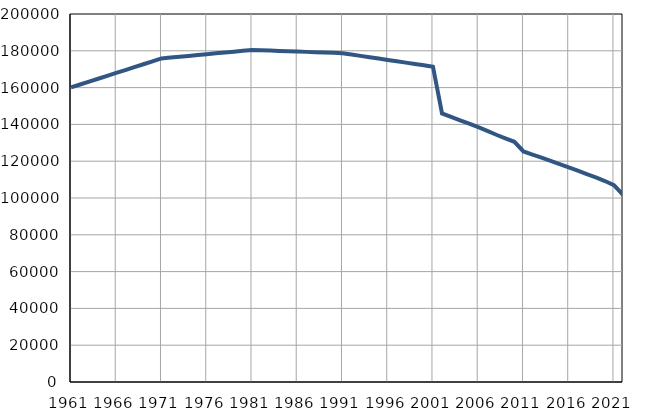
| Category | Број
становника |
|---|---|
| 1961.0 | 160096 |
| 1962.0 | 161671 |
| 1963.0 | 163246 |
| 1964.0 | 164822 |
| 1965.0 | 166397 |
| 1966.0 | 167972 |
| 1967.0 | 169547 |
| 1968.0 | 171122 |
| 1969.0 | 172698 |
| 1970.0 | 174273 |
| 1971.0 | 175848 |
| 1972.0 | 176310 |
| 1973.0 | 176771 |
| 1974.0 | 177233 |
| 1975.0 | 177694 |
| 1976.0 | 178156 |
| 1977.0 | 178617 |
| 1978.0 | 179079 |
| 1979.0 | 179540 |
| 1980.0 | 180002 |
| 1981.0 | 180463 |
| 1982.0 | 180289 |
| 1983.0 | 180114 |
| 1984.0 | 179940 |
| 1985.0 | 179765 |
| 1986.0 | 179591 |
| 1987.0 | 179416 |
| 1988.0 | 179242 |
| 1989.0 | 179067 |
| 1990.0 | 178893 |
| 1991.0 | 178718 |
| 1992.0 | 177982 |
| 1993.0 | 177245 |
| 1994.0 | 176509 |
| 1995.0 | 175773 |
| 1996.0 | 175037 |
| 1997.0 | 174300 |
| 1998.0 | 173564 |
| 1999.0 | 172828 |
| 2000.0 | 172092 |
| 2001.0 | 171355 |
| 2002.0 | 145970 |
| 2003.0 | 144121 |
| 2004.0 | 142240 |
| 2005.0 | 140367 |
| 2006.0 | 138462 |
| 2007.0 | 136437 |
| 2008.0 | 134375 |
| 2009.0 | 132464 |
| 2010.0 | 130557 |
| 2011.0 | 125285 |
| 2012.0 | 123616 |
| 2013.0 | 121909 |
| 2014.0 | 120156 |
| 2015.0 | 118384 |
| 2016.0 | 116602 |
| 2017.0 | 114816 |
| 2018.0 | 113000 |
| 2019.0 | 111152 |
| 2020.0 | 109210 |
| 2021.0 | 106971 |
| 2022.0 | 101744 |